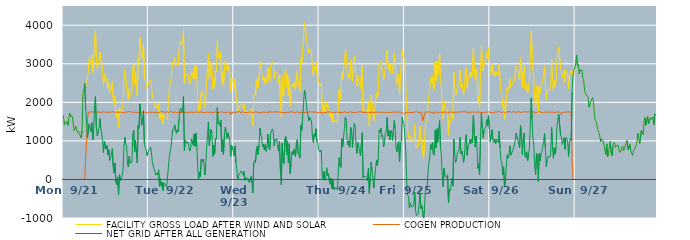
| Category | FACILITY GROSS LOAD AFTER WIND AND SOLAR | COGEN PRODUCTION | NET GRID AFTER ALL GENERATION |
|---|---|---|---|
|  Mon  9/21 | 1658 | 0 | 1658 |
|  Mon  9/21 | 1417 | 0 | 1417 |
|  Mon  9/21 | 1460 | 0 | 1460 |
|  Mon  9/21 | 1509 | 0 | 1509 |
|  Mon  9/21 | 1480 | 0 | 1480 |
|  Mon  9/21 | 1406 | 0 | 1406 |
|  Mon  9/21 | 1573 | 0 | 1573 |
|  Mon  9/21 | 1718 | 0 | 1718 |
|  Mon  9/21 | 1633 | 0 | 1633 |
|  Mon  9/21 | 1624 | 0 | 1624 |
|  Mon  9/21 | 1629 | 0 | 1629 |
|  Mon  9/21 | 1604 | 0 | 1604 |
|  Mon  9/21 | 1266 | 0 | 1266 |
|  Mon  9/21 | 1310 | 0 | 1310 |
|  Mon  9/21 | 1379 | 0 | 1379 |
|  Mon  9/21 | 1267 | 0 | 1267 |
|  Mon  9/21 | 1220 | 0 | 1220 |
|  Mon  9/21 | 1246 | 0 | 1246 |
|  Mon  9/21 | 1186 | 0 | 1186 |
|  Mon  9/21 | 1186 | 0 | 1186 |
|  Mon  9/21 | 1078 | 0 | 1078 |
|  Mon  9/21 | 1276 | 0 | 1276 |
|  Mon  9/21 | 2267 | 0 | 2267 |
|  Mon  9/21 | 2334 | 0 | 2334 |
|  Mon  9/21 | 2494 | 0 | 2494 |
|  Mon  9/21 | 2430 | 602 | 1828 |
|  Mon  9/21 | 2492 | 993 | 1499 |
|  Mon  9/21 | 2630 | 1546 | 1084 |
|  Mon  9/21 | 2815 | 1745 | 1070 |
|  Mon  9/21 | 3182 | 1742 | 1440 |
|  Mon  9/21 | 3046 | 1746 | 1300 |
|  Mon  9/21 | 2983 | 1744 | 1239 |
|  Mon  9/21 | 3226 | 1757 | 1469 |
|  Mon  9/21 | 2781 | 1756 | 1025 |
|  Mon  9/21 | 3043 | 1753 | 1290 |
|  Mon  9/21 | 3668 | 1749 | 1919 |
|  Mon  9/21 | 3899 | 1745 | 2154 |
|  Mon  9/21 | 3097 | 1752 | 1345 |
|  Mon  9/21 | 2876 | 1748 | 1128 |
|  Mon  9/21 | 2971 | 1741 | 1230 |
|  Mon  9/21 | 3089 | 1746 | 1343 |
|  Mon  9/21 | 3308 | 1731 | 1577 |
|  Mon  9/21 | 3066 | 1734 | 1332 |
|  Mon  9/21 | 3101 | 1744 | 1357 |
|  Mon  9/21 | 2775 | 1750 | 1025 |
|  Mon  9/21 | 2459 | 1762 | 697 |
|  Mon  9/21 | 2745 | 1748 | 997 |
|  Mon  9/21 | 2750 | 1738 | 1012 |
|  Mon  9/21 | 2539 | 1750 | 789 |
|  Mon  9/21 | 2624 | 1747 | 877 |
|  Mon  9/21 | 2381 | 1740 | 641 |
|  Mon  9/21 | 2527 | 1757 | 770 |
|  Mon  9/21 | 2240 | 1748 | 492 |
|  Mon  9/21 | 2285 | 1749 | 536 |
|  Mon  9/21 | 2289 | 1748 | 541 |
|  Mon  9/21 | 2543 | 1742 | 801 |
|  Mon  9/21 | 2075 | 1760 | 315 |
|  Mon  9/21 | 1908 | 1746 | 162 |
|  Mon  9/21 | 2164 | 1738 | 426 |
|  Mon  9/21 | 1663 | 1745 | -82 |
|  Mon  9/21 | 1609 | 1747 | -138 |
|  Mon  9/21 | 1812 | 1745 | 67 |
|  Mon  9/21 | 1347 | 1743 | -396 |
|  Mon  9/21 | 1863 | 1741 | 122 |
|  Mon  9/21 | 1711 | 1745 | -34 |
|  Mon  9/21 | 1749 | 1743 | 6 |
|  Mon  9/21 | 1758 | 1738 | 20 |
|  Mon  9/21 | 1950 | 1726 | 224 |
|  Mon  9/21 | 2538 | 1734 | 804 |
|  Mon  9/21 | 2843 | 1747 | 1096 |
|  Mon  9/21 | 2661 | 1751 | 910 |
|  Mon  9/21 | 2637 | 1753 | 884 |
|  Mon  9/21 | 2149 | 1751 | 398 |
|  Mon  9/21 | 2068 | 1744 | 324 |
|  Mon  9/21 | 2359 | 1762 | 597 |
|  Mon  9/21 | 2158 | 1740 | 418 |
|  Mon  9/21 | 2158 | 1747 | 411 |
|  Mon  9/21 | 2204 | 1746 | 458 |
|  Mon  9/21 | 2933 | 1741 | 1192 |
|  Mon  9/21 | 3021 | 1746 | 1275 |
|  Mon  9/21 | 2461 | 1746 | 715 |
|  Mon  9/21 | 2749 | 1737 | 1012 |
|  Mon  9/21 | 2425 | 1731 | 694 |
|  Mon  9/21 | 2167 | 1741 | 426 |
|  Mon  9/21 | 3144 | 1744 | 1400 |
|  Mon  9/21 | 3070 | 1742 | 1328 |
|  Mon  9/21 | 3698 | 1737 | 1961 |
|  Mon  9/21 | 3418 | 1748 | 1670 |
|  Mon  9/21 | 3124 | 1718 | 1406 |
|  Mon  9/21 | 3317 | 1748 | 1569 |
|  Mon  9/21 | 3535 | 1752 | 1783 |
|  Mon  9/21 | 2659 | 1747 | 912 |
|  Mon  9/21 | 2563 | 1740 | 823 |
|  Mon  9/21 | 2514 | 1735 | 779 |
|  Mon  9/21 | 2367 | 1749 | 618 |
|  Mon  9/21 | 2447 | 1741 | 706 |
|  Tue  9/22 | 2490 | 1741 | 749 |
|  Tue  9/22 | 2552 | 1748 | 804 |
|  Tue  9/22 | 2584 | 1745 | 839 |
|  Tue  9/22 | 2444 | 1746 | 698 |
|  Tue  9/22 | 2183 | 1754 | 429 |
|  Tue  9/22 | 2177 | 1749 | 428 |
|  Tue  9/22 | 2006 | 1730 | 276 |
|  Tue  9/22 | 2011 | 1733 | 278 |
|  Tue  9/22 | 1855 | 1743 | 112 |
|  Tue  9/22 | 1918 | 1749 | 169 |
|  Tue  9/22 | 1841 | 1726 | 115 |
|  Tue  9/22 | 1975 | 1724 | 251 |
|  Tue  9/22 | 1570 | 1746 | -176 |
|  Tue  9/22 | 1777 | 1754 | 23 |
|  Tue  9/22 | 1565 | 1743 | -178 |
|  Tue  9/22 | 1687 | 1760 | -73 |
|  Tue  9/22 | 1443 | 1735 | -292 |
|  Tue  9/22 | 1661 | 1750 | -89 |
|  Tue  9/22 | 1640 | 1754 | -114 |
|  Tue  9/22 | 1576 | 1740 | -164 |
|  Tue  9/22 | 1567 | 1762 | -195 |
|  Tue  9/22 | 1556 | 1760 | -204 |
|  Tue  9/22 | 2044 | 1727 | 317 |
|  Tue  9/22 | 2314 | 1745 | 569 |
|  Tue  9/22 | 2473 | 1761 | 712 |
|  Tue  9/22 | 2615 | 1745 | 870 |
|  Tue  9/22 | 2841 | 1752 | 1089 |
|  Tue  9/22 | 3059 | 1753 | 1306 |
|  Tue  9/22 | 3013 | 1734 | 1279 |
|  Tue  9/22 | 3166 | 1744 | 1422 |
|  Tue  9/22 | 3063 | 1754 | 1309 |
|  Tue  9/22 | 2945 | 1749 | 1196 |
|  Tue  9/22 | 3010 | 1722 | 1288 |
|  Tue  9/22 | 2954 | 1723 | 1231 |
|  Tue  9/22 | 3340 | 1758 | 1582 |
|  Tue  9/22 | 3539 | 1743 | 1796 |
|  Tue  9/22 | 3583 | 1731 | 1852 |
|  Tue  9/22 | 3492 | 1762 | 1730 |
|  Tue  9/22 | 3521 | 1732 | 1789 |
|  Tue  9/22 | 3909 | 1752 | 2157 |
|  Tue  9/22 | 2475 | 1729 | 746 |
|  Tue  9/22 | 2764 | 1747 | 1017 |
|  Tue  9/22 | 2769 | 1735 | 1034 |
|  Tue  9/22 | 2676 | 1741 | 935 |
|  Tue  9/22 | 2718 | 1743 | 975 |
|  Tue  9/22 | 2596 | 1747 | 849 |
|  Tue  9/22 | 2483 | 1744 | 739 |
|  Tue  9/22 | 2586 | 1762 | 824 |
|  Tue  9/22 | 2805 | 1752 | 1053 |
|  Tue  9/22 | 2820 | 1744 | 1076 |
|  Tue  9/22 | 2621 | 1733 | 888 |
|  Tue  9/22 | 2927 | 1746 | 1181 |
|  Tue  9/22 | 2601 | 1745 | 856 |
|  Tue  9/22 | 2958 | 1757 | 1201 |
|  Tue  9/22 | 2621 | 1751 | 870 |
|  Tue  9/22 | 2073 | 1744 | 329 |
|  Tue  9/22 | 1734 | 1743 | -9 |
|  Tue  9/22 | 1944 | 1747 | 197 |
|  Tue  9/22 | 1820 | 1752 | 68 |
|  Tue  9/22 | 2272 | 1745 | 527 |
|  Tue  9/22 | 2204 | 1745 | 459 |
|  Tue  9/22 | 2276 | 1747 | 529 |
|  Tue  9/22 | 2152 | 1742 | 410 |
|  Tue  9/22 | 1858 | 1739 | 119 |
|  Tue  9/22 | 2096 | 1726 | 370 |
|  Tue  9/22 | 2567 | 1749 | 818 |
|  Tue  9/22 | 2886 | 1751 | 1135 |
|  Tue  9/22 | 3254 | 1761 | 1493 |
|  Tue  9/22 | 2612 | 1729 | 883 |
|  Tue  9/22 | 2662 | 1758 | 904 |
|  Tue  9/22 | 3051 | 1754 | 1297 |
|  Tue  9/22 | 2936 | 1732 | 1204 |
|  Tue  9/22 | 2324 | 1729 | 595 |
|  Tue  9/22 | 2632 | 1743 | 889 |
|  Tue  9/22 | 2394 | 1738 | 656 |
|  Tue  9/22 | 2824 | 1751 | 1073 |
|  Tue  9/22 | 2786 | 1743 | 1043 |
|  Tue  9/22 | 3599 | 1736 | 1863 |
|  Tue  9/22 | 3176 | 1739 | 1437 |
|  Tue  9/22 | 3217 | 1737 | 1480 |
|  Tue  9/22 | 3119 | 1730 | 1389 |
|  Tue  9/22 | 3297 | 1754 | 1543 |
|  Tue  9/22 | 2461 | 1748 | 713 |
|  Tue  9/22 | 2782 | 1751 | 1031 |
|  Tue  9/22 | 2406 | 1760 | 646 |
|  Tue  9/22 | 2886 | 1733 | 1153 |
|  Tue  9/22 | 3087 | 1732 | 1355 |
|  Tue  9/22 | 2973 | 1741 | 1232 |
|  Tue  9/22 | 2804 | 1739 | 1065 |
|  Tue  9/22 | 2955 | 1748 | 1207 |
|  Tue  9/22 | 2956 | 1750 | 1206 |
|  Tue  9/22 | 2781 | 1742 | 1039 |
|  Tue  9/22 | 2267 | 1682 | 585 |
|  Tue  9/22 | 2640 | 1747 | 893 |
|  Tue  9/22 | 2600 | 1712 | 888 |
|  Tue  9/22 | 2514 | 1758 | 756 |
|  Wed  9/23 | 2344 | 1729 | 615 |
|  Wed  9/23 | 2611 | 1739 | 872 |
|  Wed  9/23 | 2176 | 1750 | 426 |
|  Wed  9/23 | 2023 | 1758 | 265 |
|  Wed  9/23 | 1747 | 1751 | -4 |
|  Wed  9/23 | 1845 | 1734 | 111 |
|  Wed  9/23 | 1903 | 1761 | 142 |
|  Wed  9/23 | 1918 | 1754 | 164 |
|  Wed  9/23 | 1952 | 1728 | 224 |
|  Wed  9/23 | 1910 | 1757 | 153 |
|  Wed  9/23 | 1856 | 1750 | 106 |
|  Wed  9/23 | 1952 | 1741 | 211 |
|  Wed  9/23 | 1721 | 1744 | -23 |
|  Wed  9/23 | 1784 | 1737 | 47 |
|  Wed  9/23 | 1717 | 1734 | -17 |
|  Wed  9/23 | 1778 | 1737 | 41 |
|  Wed  9/23 | 1761 | 1752 | 9 |
|  Wed  9/23 | 1665 | 1750 | -85 |
|  Wed  9/23 | 1663 | 1741 | -78 |
|  Wed  9/23 | 1820 | 1745 | 75 |
|  Wed  9/23 | 1685 | 1760 | -75 |
|  Wed  9/23 | 1394 | 1741 | -347 |
|  Wed  9/23 | 2188 | 1747 | 441 |
|  Wed  9/23 | 2233 | 1743 | 490 |
|  Wed  9/23 | 2184 | 1745 | 439 |
|  Wed  9/23 | 2537 | 1756 | 781 |
|  Wed  9/23 | 2604 | 1735 | 869 |
|  Wed  9/23 | 2381 | 1733 | 648 |
|  Wed  9/23 | 2661 | 1755 | 906 |
|  Wed  9/23 | 3067 | 1737 | 1330 |
|  Wed  9/23 | 2905 | 1739 | 1166 |
|  Wed  9/23 | 2807 | 1739 | 1068 |
|  Wed  9/23 | 2582 | 1740 | 842 |
|  Wed  9/23 | 2659 | 1753 | 906 |
|  Wed  9/23 | 2517 | 1746 | 771 |
|  Wed  9/23 | 2651 | 1739 | 912 |
|  Wed  9/23 | 2480 | 1750 | 730 |
|  Wed  9/23 | 2616 | 1752 | 864 |
|  Wed  9/23 | 2902 | 1723 | 1179 |
|  Wed  9/23 | 2597 | 1763 | 834 |
|  Wed  9/23 | 2522 | 1754 | 768 |
|  Wed  9/23 | 2948 | 1750 | 1198 |
|  Wed  9/23 | 2935 | 1751 | 1184 |
|  Wed  9/23 | 3058 | 1747 | 1311 |
|  Wed  9/23 | 2973 | 1734 | 1239 |
|  Wed  9/23 | 2620 | 1751 | 869 |
|  Wed  9/23 | 2786 | 1742 | 1044 |
|  Wed  9/23 | 2766 | 1751 | 1015 |
|  Wed  9/23 | 2788 | 1730 | 1058 |
|  Wed  9/23 | 2604 | 1751 | 853 |
|  Wed  9/23 | 2484 | 1751 | 733 |
|  Wed  9/23 | 2734 | 1745 | 989 |
|  Wed  9/23 | 1976 | 1749 | 227 |
|  Wed  9/23 | 1602 | 1740 | -138 |
|  Wed  9/23 | 2680 | 1733 | 947 |
|  Wed  9/23 | 2199 | 1730 | 469 |
|  Wed  9/23 | 2163 | 1748 | 415 |
|  Wed  9/23 | 2792 | 1734 | 1058 |
|  Wed  9/23 | 2851 | 1732 | 1119 |
|  Wed  9/23 | 2383 | 1742 | 641 |
|  Wed  9/23 | 2735 | 1734 | 1001 |
|  Wed  9/23 | 2176 | 1742 | 434 |
|  Wed  9/23 | 2662 | 1735 | 927 |
|  Wed  9/23 | 1903 | 1753 | 150 |
|  Wed  9/23 | 2179 | 1747 | 432 |
|  Wed  9/23 | 2473 | 1755 | 718 |
|  Wed  9/23 | 2406 | 1761 | 645 |
|  Wed  9/23 | 2524 | 1738 | 786 |
|  Wed  9/23 | 2519 | 1731 | 788 |
|  Wed  9/23 | 2333 | 1737 | 596 |
|  Wed  9/23 | 2684 | 1750 | 934 |
|  Wed  9/23 | 2805 | 1767 | 1038 |
|  Wed  9/23 | 2416 | 1734 | 682 |
|  Wed  9/23 | 2384 | 1752 | 632 |
|  Wed  9/23 | 2300 | 1745 | 555 |
|  Wed  9/23 | 3130 | 1729 | 1401 |
|  Wed  9/23 | 3012 | 1737 | 1275 |
|  Wed  9/23 | 3333 | 1735 | 1598 |
|  Wed  9/23 | 3335 | 1743 | 1592 |
|  Wed  9/23 | 4069 | 1752 | 2317 |
|  Wed  9/23 | 3948 | 1737 | 2211 |
|  Wed  9/23 | 3928 | 1735 | 2193 |
|  Wed  9/23 | 3526 | 1743 | 1783 |
|  Wed  9/23 | 3418 | 1746 | 1672 |
|  Wed  9/23 | 3278 | 1754 | 1524 |
|  Wed  9/23 | 3352 | 1741 | 1611 |
|  Wed  9/23 | 3380 | 1749 | 1631 |
|  Wed  9/23 | 3265 | 1748 | 1517 |
|  Wed  9/23 | 2848 | 1751 | 1097 |
|  Wed  9/23 | 2699 | 1740 | 959 |
|  Wed  9/23 | 2934 | 1750 | 1184 |
|  Wed  9/23 | 2855 | 1742 | 1113 |
|  Wed  9/23 | 3061 | 1746 | 1315 |
|  Wed  9/23 | 2724 | 1747 | 977 |
|  Wed  9/23 | 2675 | 1729 | 946 |
|  Wed  9/23 | 2531 | 1746 | 785 |
|  Thu  9/24 | 2447 | 1740 | 707 |
|  Thu  9/24 | 2418 | 1735 | 683 |
|  Thu  9/24 | 2502 | 1736 | 766 |
|  Thu  9/24 | 1869 | 1742 | 127 |
|  Thu  9/24 | 1741 | 1727 | 14 |
|  Thu  9/24 | 1941 | 1734 | 207 |
|  Thu  9/24 | 1715 | 1735 | -20 |
|  Thu  9/24 | 1786 | 1741 | 45 |
|  Thu  9/24 | 2036 | 1733 | 303 |
|  Thu  9/24 | 1859 | 1761 | 98 |
|  Thu  9/24 | 1893 | 1740 | 153 |
|  Thu  9/24 | 1711 | 1748 | -37 |
|  Thu  9/24 | 1618 | 1745 | -127 |
|  Thu  9/24 | 1778 | 1748 | 30 |
|  Thu  9/24 | 1489 | 1729 | -240 |
|  Thu  9/24 | 1713 | 1738 | -25 |
|  Thu  9/24 | 1485 | 1745 | -260 |
|  Thu  9/24 | 1532 | 1734 | -202 |
|  Thu  9/24 | 1502 | 1754 | -252 |
|  Thu  9/24 | 1528 | 1748 | -220 |
|  Thu  9/24 | 1481 | 1746 | -265 |
|  Thu  9/24 | 1482 | 1746 | -264 |
|  Thu  9/24 | 2334 | 1771 | 563 |
|  Thu  9/24 | 2104 | 1734 | 370 |
|  Thu  9/24 | 2058 | 1750 | 308 |
|  Thu  9/24 | 2799 | 1736 | 1063 |
|  Thu  9/24 | 2583 | 1743 | 840 |
|  Thu  9/24 | 2837 | 1746 | 1091 |
|  Thu  9/24 | 3060 | 1741 | 1319 |
|  Thu  9/24 | 3370 | 1752 | 1618 |
|  Thu  9/24 | 3290 | 1754 | 1536 |
|  Thu  9/24 | 2749 | 1736 | 1013 |
|  Thu  9/24 | 2630 | 1745 | 885 |
|  Thu  9/24 | 2742 | 1743 | 999 |
|  Thu  9/24 | 2592 | 1757 | 835 |
|  Thu  9/24 | 3109 | 1755 | 1354 |
|  Thu  9/24 | 3071 | 1754 | 1317 |
|  Thu  9/24 | 2563 | 1732 | 831 |
|  Thu  9/24 | 2897 | 1749 | 1148 |
|  Thu  9/24 | 3191 | 1738 | 1453 |
|  Thu  9/24 | 3114 | 1744 | 1370 |
|  Thu  9/24 | 2647 | 1733 | 914 |
|  Thu  9/24 | 2422 | 1745 | 677 |
|  Thu  9/24 | 2710 | 1753 | 957 |
|  Thu  9/24 | 2618 | 1750 | 868 |
|  Thu  9/24 | 2470 | 1752 | 718 |
|  Thu  9/24 | 2363 | 1741 | 622 |
|  Thu  9/24 | 2669 | 1756 | 913 |
|  Thu  9/24 | 2966 | 1752 | 1214 |
|  Thu  9/24 | 1773 | 1735 | 38 |
|  Thu  9/24 | 1832 | 1755 | 77 |
|  Thu  9/24 | 1830 | 1742 | 88 |
|  Thu  9/24 | 1815 | 1735 | 80 |
|  Thu  9/24 | 1780 | 1737 | 43 |
|  Thu  9/24 | 1700 | 1736 | -36 |
|  Thu  9/24 | 2025 | 1739 | 286 |
|  Thu  9/24 | 1383 | 1747 | -364 |
|  Thu  9/24 | 1759 | 1739 | 20 |
|  Thu  9/24 | 2184 | 1740 | 444 |
|  Thu  9/24 | 1965 | 1741 | 224 |
|  Thu  9/24 | 1762 | 1737 | 25 |
|  Thu  9/24 | 1521 | 1738 | -217 |
|  Thu  9/24 | 1803 | 1750 | 53 |
|  Thu  9/24 | 2021 | 1742 | 279 |
|  Thu  9/24 | 2254 | 1750 | 504 |
|  Thu  9/24 | 2110 | 1752 | 358 |
|  Thu  9/24 | 2280 | 1743 | 537 |
|  Thu  9/24 | 3020 | 1737 | 1283 |
|  Thu  9/24 | 2974 | 1747 | 1227 |
|  Thu  9/24 | 3074 | 1744 | 1330 |
|  Thu  9/24 | 2845 | 1739 | 1106 |
|  Thu  9/24 | 2886 | 1741 | 1145 |
|  Thu  9/24 | 2590 | 1748 | 842 |
|  Thu  9/24 | 2691 | 1733 | 958 |
|  Thu  9/24 | 2944 | 1745 | 1199 |
|  Thu  9/24 | 2993 | 1744 | 1249 |
|  Thu  9/24 | 3352 | 1747 | 1605 |
|  Thu  9/24 | 2868 | 1739 | 1129 |
|  Thu  9/24 | 3023 | 1747 | 1276 |
|  Thu  9/24 | 2763 | 1736 | 1027 |
|  Thu  9/24 | 2976 | 1729 | 1247 |
|  Thu  9/24 | 3018 | 1739 | 1279 |
|  Thu  9/24 | 2753 | 1739 | 1014 |
|  Thu  9/24 | 3002 | 1751 | 1251 |
|  Thu  9/24 | 3281 | 1750 | 1531 |
|  Thu  9/24 | 3058 | 1742 | 1316 |
|  Thu  9/24 | 2562 | 1757 | 805 |
|  Thu  9/24 | 2470 | 1756 | 714 |
|  Thu  9/24 | 2655 | 1745 | 910 |
|  Thu  9/24 | 2730 | 1743 | 987 |
|  Thu  9/24 | 2203 | 1744 | 459 |
|  Thu  9/24 | 2710 | 1753 | 957 |
|  Thu  9/24 | 2716 | 1727 | 989 |
|  Thu  9/24 | 3363 | 1741 | 1622 |
|  Thu  9/24 | 3183 | 1733 | 1450 |
|  Thu  9/24 | 3156 | 1742 | 1414 |
|  Fri  9/25 | 3094 | 1686 | 1408 |
|  Fri  9/25 | 2473 | 1747 | 726 |
|  Fri  9/25 | 1699 | 1760 | -61 |
|  Fri  9/25 | 1325 | 1732 | -407 |
|  Fri  9/25 | 1300 | 1737 | -437 |
|  Fri  9/25 | 1008 | 1745 | -737 |
|  Fri  9/25 | 1141 | 1748 | -607 |
|  Fri  9/25 | 1120 | 1732 | -612 |
|  Fri  9/25 | 1027 | 1750 | -723 |
|  Fri  9/25 | 998 | 1737 | -739 |
|  Fri  9/25 | 1073 | 1738 | -665 |
|  Fri  9/25 | 1422 | 1747 | -325 |
|  Fri  9/25 | 931 | 1738 | -807 |
|  Fri  9/25 | 824 | 1767 | -943 |
|  Fri  9/25 | 836 | 1750 | -914 |
|  Fri  9/25 | 853 | 1736 | -883 |
|  Fri  9/25 | 857 | 1730 | -873 |
|  Fri  9/25 | 1382 | 1743 | -361 |
|  Fri  9/25 | 989 | 1742 | -753 |
|  Fri  9/25 | 1056 | 1740 | -684 |
|  Fri  9/25 | 665 | 1528 | -863 |
|  Fri  9/25 | 539 | 1598 | -1059 |
|  Fri  9/25 | 916 | 1674 | -758 |
|  Fri  9/25 | 1441 | 1748 | -307 |
|  Fri  9/25 | 1437 | 1738 | -301 |
|  Fri  9/25 | 1510 | 1745 | -235 |
|  Fri  9/25 | 1938 | 1735 | 203 |
|  Fri  9/25 | 2190 | 1754 | 436 |
|  Fri  9/25 | 2337 | 1755 | 582 |
|  Fri  9/25 | 2649 | 1742 | 907 |
|  Fri  9/25 | 2534 | 1747 | 787 |
|  Fri  9/25 | 2689 | 1724 | 965 |
|  Fri  9/25 | 2403 | 1750 | 653 |
|  Fri  9/25 | 2315 | 1694 | 621 |
|  Fri  9/25 | 3040 | 1758 | 1282 |
|  Fri  9/25 | 2558 | 1736 | 822 |
|  Fri  9/25 | 3058 | 1741 | 1317 |
|  Fri  9/25 | 2706 | 1741 | 965 |
|  Fri  9/25 | 3039 | 1742 | 1297 |
|  Fri  9/25 | 3281 | 1749 | 1532 |
|  Fri  9/25 | 2572 | 1743 | 829 |
|  Fri  9/25 | 2373 | 1740 | 633 |
|  Fri  9/25 | 1845 | 1745 | 100 |
|  Fri  9/25 | 1566 | 1755 | -189 |
|  Fri  9/25 | 2032 | 1744 | 288 |
|  Fri  9/25 | 1848 | 1742 | 106 |
|  Fri  9/25 | 1853 | 1752 | 101 |
|  Fri  9/25 | 1788 | 1750 | 38 |
|  Fri  9/25 | 1846 | 1723 | 123 |
|  Fri  9/25 | 1136 | 1742 | -606 |
|  Fri  9/25 | 1499 | 1751 | -252 |
|  Fri  9/25 | 1457 | 1744 | -287 |
|  Fri  9/25 | 1624 | 1750 | -126 |
|  Fri  9/25 | 1771 | 1743 | 28 |
|  Fri  9/25 | 1568 | 1742 | -174 |
|  Fri  9/25 | 2786 | 1746 | 1040 |
|  Fri  9/25 | 2417 | 1741 | 676 |
|  Fri  9/25 | 2183 | 1737 | 446 |
|  Fri  9/25 | 2255 | 1740 | 515 |
|  Fri  9/25 | 2429 | 1750 | 679 |
|  Fri  9/25 | 2414 | 1752 | 662 |
|  Fri  9/25 | 2517 | 1743 | 774 |
|  Fri  9/25 | 2840 | 1749 | 1091 |
|  Fri  9/25 | 2397 | 1735 | 662 |
|  Fri  9/25 | 2490 | 1754 | 736 |
|  Fri  9/25 | 2358 | 1751 | 607 |
|  Fri  9/25 | 2208 | 1762 | 446 |
|  Fri  9/25 | 2375 | 1737 | 638 |
|  Fri  9/25 | 2794 | 1753 | 1041 |
|  Fri  9/25 | 2906 | 1746 | 1160 |
|  Fri  9/25 | 2374 | 1745 | 629 |
|  Fri  9/25 | 2591 | 1736 | 855 |
|  Fri  9/25 | 2652 | 1746 | 906 |
|  Fri  9/25 | 2772 | 1735 | 1037 |
|  Fri  9/25 | 2663 | 1739 | 924 |
|  Fri  9/25 | 2791 | 1740 | 1051 |
|  Fri  9/25 | 2695 | 1749 | 946 |
|  Fri  9/25 | 3400 | 1743 | 1657 |
|  Fri  9/25 | 2943 | 1752 | 1191 |
|  Fri  9/25 | 2589 | 1745 | 844 |
|  Fri  9/25 | 2867 | 1742 | 1125 |
|  Fri  9/25 | 2675 | 1737 | 938 |
|  Fri  9/25 | 2042 | 1751 | 291 |
|  Fri  9/25 | 2155 | 1748 | 407 |
|  Fri  9/25 | 1869 | 1742 | 127 |
|  Fri  9/25 | 2847 | 1751 | 1096 |
|  Fri  9/25 | 3466 | 1740 | 1726 |
|  Fri  9/25 | 3056 | 1739 | 1317 |
|  Fri  9/25 | 2811 | 1736 | 1075 |
|  Fri  9/25 | 3018 | 1731 | 1287 |
|  Fri  9/25 | 3062 | 1745 | 1317 |
|  Fri  9/25 | 3124 | 1745 | 1379 |
|  Fri  9/25 | 3294 | 1745 | 1549 |
|  Fri  9/25 | 3132 | 1748 | 1384 |
|  Fri  9/25 | 3417 | 1752 | 1665 |
|  Fri  9/25 | 3042 | 1741 | 1301 |
|  Sat  9/26 | 2723 | 1742 | 981 |
|  Sat  9/26 | 2752 | 1749 | 1003 |
|  Sat  9/26 | 3019 | 1729 | 1290 |
|  Sat  9/26 | 2773 | 1749 | 1024 |
|  Sat  9/26 | 2691 | 1731 | 960 |
|  Sat  9/26 | 2802 | 1755 | 1047 |
|  Sat  9/26 | 2680 | 1758 | 922 |
|  Sat  9/26 | 2792 | 1751 | 1041 |
|  Sat  9/26 | 2786 | 1748 | 1038 |
|  Sat  9/26 | 2698 | 1738 | 960 |
|  Sat  9/26 | 3022 | 1771 | 1251 |
|  Sat  9/26 | 2547 | 1743 | 804 |
|  Sat  9/26 | 2260 | 1748 | 512 |
|  Sat  9/26 | 2168 | 1742 | 426 |
|  Sat  9/26 | 1874 | 1750 | 124 |
|  Sat  9/26 | 2078 | 1749 | 329 |
|  Sat  9/26 | 1554 | 1751 | -197 |
|  Sat  9/26 | 1685 | 1737 | -52 |
|  Sat  9/26 | 2060 | 1746 | 314 |
|  Sat  9/26 | 2390 | 1751 | 639 |
|  Sat  9/26 | 2293 | 1742 | 551 |
|  Sat  9/26 | 2372 | 1760 | 612 |
|  Sat  9/26 | 2616 | 1744 | 872 |
|  Sat  9/26 | 2390 | 1759 | 631 |
|  Sat  9/26 | 2411 | 1729 | 682 |
|  Sat  9/26 | 2458 | 1755 | 703 |
|  Sat  9/26 | 2554 | 1764 | 790 |
|  Sat  9/26 | 2524 | 1754 | 770 |
|  Sat  9/26 | 2750 | 1750 | 1000 |
|  Sat  9/26 | 2938 | 1735 | 1203 |
|  Sat  9/26 | 2943 | 1737 | 1206 |
|  Sat  9/26 | 2780 | 1759 | 1021 |
|  Sat  9/26 | 2766 | 1739 | 1027 |
|  Sat  9/26 | 2570 | 1748 | 822 |
|  Sat  9/26 | 3150 | 1747 | 1403 |
|  Sat  9/26 | 2920 | 1740 | 1180 |
|  Sat  9/26 | 2384 | 1737 | 647 |
|  Sat  9/26 | 2804 | 1749 | 1055 |
|  Sat  9/26 | 2948 | 1745 | 1203 |
|  Sat  9/26 | 2353 | 1755 | 598 |
|  Sat  9/26 | 2303 | 1740 | 563 |
|  Sat  9/26 | 2465 | 1751 | 714 |
|  Sat  9/26 | 2240 | 1757 | 483 |
|  Sat  9/26 | 2389 | 1754 | 635 |
|  Sat  9/26 | 2583 | 1756 | 827 |
|  Sat  9/26 | 3118 | 1749 | 1369 |
|  Sat  9/26 | 3853 | 1738 | 2115 |
|  Sat  9/26 | 3293 | 1732 | 1561 |
|  Sat  9/26 | 2813 | 1763 | 1050 |
|  Sat  9/26 | 2633 | 1748 | 885 |
|  Sat  9/26 | 2076 | 1729 | 347 |
|  Sat  9/26 | 1853 | 1736 | 117 |
|  Sat  9/26 | 2414 | 1741 | 673 |
|  Sat  9/26 | 2341 | 1734 | 607 |
|  Sat  9/26 | 1701 | 1752 | -51 |
|  Sat  9/26 | 2417 | 1741 | 676 |
|  Sat  9/26 | 2234 | 1757 | 477 |
|  Sat  9/26 | 2397 | 1744 | 653 |
|  Sat  9/26 | 2453 | 1732 | 721 |
|  Sat  9/26 | 2476 | 1745 | 731 |
|  Sat  9/26 | 2722 | 1739 | 983 |
|  Sat  9/26 | 2956 | 1756 | 1200 |
|  Sat  9/26 | 2549 | 1749 | 800 |
|  Sat  9/26 | 2084 | 1752 | 332 |
|  Sat  9/26 | 2257 | 1738 | 519 |
|  Sat  9/26 | 2340 | 1743 | 597 |
|  Sat  9/26 | 2363 | 1765 | 598 |
|  Sat  9/26 | 2314 | 1737 | 577 |
|  Sat  9/26 | 2418 | 1736 | 682 |
|  Sat  9/26 | 3115 | 1755 | 1360 |
|  Sat  9/26 | 2564 | 1739 | 825 |
|  Sat  9/26 | 2296 | 1743 | 553 |
|  Sat  9/26 | 2564 | 1740 | 824 |
|  Sat  9/26 | 2391 | 1733 | 658 |
|  Sat  9/26 | 2567 | 1748 | 819 |
|  Sat  9/26 | 3140 | 1751 | 1389 |
|  Sat  9/26 | 3302 | 1754 | 1548 |
|  Sat  9/26 | 3444 | 1752 | 1692 |
|  Sat  9/26 | 3436 | 1737 | 1699 |
|  Sat  9/26 | 2883 | 1730 | 1153 |
|  Sat  9/26 | 2777 | 1676 | 1101 |
|  Sat  9/26 | 2646 | 1740 | 906 |
|  Sat  9/26 | 2750 | 1764 | 986 |
|  Sat  9/26 | 2829 | 1746 | 1083 |
|  Sat  9/26 | 2519 | 1738 | 781 |
|  Sat  9/26 | 2835 | 1748 | 1087 |
|  Sat  9/26 | 2780 | 1734 | 1046 |
|  Sat  9/26 | 2753 | 1754 | 999 |
|  Sat  9/26 | 2342 | 1744 | 598 |
|  Sat  9/26 | 2690 | 1752 | 938 |
|  Sat  9/26 | 2796 | 1735 | 1061 |
|  Sat  9/26 | 2756 | 1746 | 1010 |
|  Sat  9/26 | 2824 | 566 | 2258 |
|  Sat  9/26 | 2676 | 0 | 2676 |
|  Sat  9/26 | 2849 | 0 | 2849 |
|  Sat  9/26 | 2887 | 0 | 2887 |
|  Sun  9/27 | 3002 | 0 | 3002 |
|  Sun  9/27 | 3231 | 0 | 3231 |
|  Sun  9/27 | 2960 | 0 | 2960 |
|  Sun  9/27 | 2994 | 0 | 2994 |
|  Sun  9/27 | 2738 | 0 | 2738 |
|  Sun  9/27 | 2850 | 0 | 2850 |
|  Sun  9/27 | 2809 | 0 | 2809 |
|  Sun  9/27 | 2844 | 0 | 2844 |
|  Sun  9/27 | 2637 | 0 | 2637 |
|  Sun  9/27 | 2590 | 0 | 2590 |
|  Sun  9/27 | 2320 | 0 | 2320 |
|  Sun  9/27 | 2238 | 0 | 2238 |
|  Sun  9/27 | 2193 | 0 | 2193 |
|  Sun  9/27 | 2182 | 0 | 2182 |
|  Sun  9/27 | 2125 | 0 | 2125 |
|  Sun  9/27 | 1874 | 0 | 1874 |
|  Sun  9/27 | 1879 | 0 | 1879 |
|  Sun  9/27 | 2014 | 0 | 2014 |
|  Sun  9/27 | 2003 | 0 | 2003 |
|  Sun  9/27 | 2124 | 0 | 2124 |
|  Sun  9/27 | 2022 | 0 | 2022 |
|  Sun  9/27 | 1727 | 0 | 1727 |
|  Sun  9/27 | 1537 | 0 | 1537 |
|  Sun  9/27 | 1505 | 0 | 1505 |
|  Sun  9/27 | 1512 | 0 | 1512 |
|  Sun  9/27 | 1291 | 0 | 1291 |
|  Sun  9/27 | 1229 | 0 | 1229 |
|  Sun  9/27 | 1152 | 0 | 1152 |
|  Sun  9/27 | 981 | 0 | 981 |
|  Sun  9/27 | 1056 | 0 | 1056 |
|  Sun  9/27 | 1052 | 0 | 1052 |
|  Sun  9/27 | 1001 | 0 | 1001 |
|  Sun  9/27 | 876 | 0 | 876 |
|  Sun  9/27 | 886 | 0 | 886 |
|  Sun  9/27 | 645 | 0 | 645 |
|  Sun  9/27 | 923 | 0 | 923 |
|  Sun  9/27 | 587 | 0 | 587 |
|  Sun  9/27 | 694 | 0 | 694 |
|  Sun  9/27 | 879 | 0 | 879 |
|  Sun  9/27 | 985 | 0 | 985 |
|  Sun  9/27 | 671 | 0 | 671 |
|  Sun  9/27 | 615 | 0 | 615 |
|  Sun  9/27 | 877 | 0 | 877 |
|  Sun  9/27 | 965 | 0 | 965 |
|  Sun  9/27 | 939 | 0 | 939 |
|  Sun  9/27 | 832 | 0 | 832 |
|  Sun  9/27 | 880 | 0 | 880 |
|  Sun  9/27 | 885 | 0 | 885 |
|  Sun  9/27 | 880 | 0 | 880 |
|  Sun  9/27 | 737 | 0 | 737 |
|  Sun  9/27 | 705 | 0 | 705 |
|  Sun  9/27 | 746 | 0 | 746 |
|  Sun  9/27 | 840 | 0 | 840 |
|  Sun  9/27 | 871 | 0 | 871 |
|  Sun  9/27 | 748 | 0 | 748 |
|  Sun  9/27 | 793 | 0 | 793 |
|  Sun  9/27 | 893 | 0 | 893 |
|  Sun  9/27 | 954 | 0 | 954 |
|  Sun  9/27 | 1011 | 0 | 1011 |
|  Sun  9/27 | 768 | 0 | 768 |
|  Sun  9/27 | 744 | 0 | 744 |
|  Sun  9/27 | 907 | 0 | 907 |
|  Sun  9/27 | 742 | 0 | 742 |
|  Sun  9/27 | 729 | 0 | 729 |
|  Sun  9/27 | 625 | 0 | 625 |
|  Sun  9/27 | 741 | 0 | 741 |
|  Sun  9/27 | 735 | 0 | 735 |
|  Sun  9/27 | 814 | 0 | 814 |
|  Sun  9/27 | 890 | 0 | 890 |
|  Sun  9/27 | 979 | 0 | 979 |
|  Sun  9/27 | 1195 | 0 | 1195 |
|  Sun  9/27 | 1091 | 0 | 1091 |
|  Sun  9/27 | 931 | 0 | 931 |
|  Sun  9/27 | 949 | 0 | 949 |
|  Sun  9/27 | 1276 | 0 | 1276 |
|  Sun  9/27 | 1195 | 0 | 1195 |
|  Sun  9/27 | 1162 | 0 | 1162 |
|  Sun  9/27 | 1508 | 0 | 1508 |
|  Sun  9/27 | 1608 | 0 | 1608 |
|  Sun  9/27 | 1404 | 0 | 1404 |
|  Sun  9/27 | 1429 | 0 | 1429 |
|  Sun  9/27 | 1631 | 0 | 1631 |
|  Sun  9/27 | 1449 | 0 | 1449 |
|  Sun  9/27 | 1494 | 0 | 1494 |
|  Sun  9/27 | 1607 | 0 | 1607 |
|  Sun  9/27 | 1551 | 0 | 1551 |
|  Sun  9/27 | 1595 | 0 | 1595 |
|  Sun  9/27 | 1626 | 0 | 1626 |
|  Sun  9/27 | 1416 | 0 | 1416 |
|  Sun  9/27 | 1702 | 0 | 1702 |
|  Sun  9/27 | 1669 | 0 | 1669 |
|  Sun  9/27 | 1702 | 0 | 1702 |